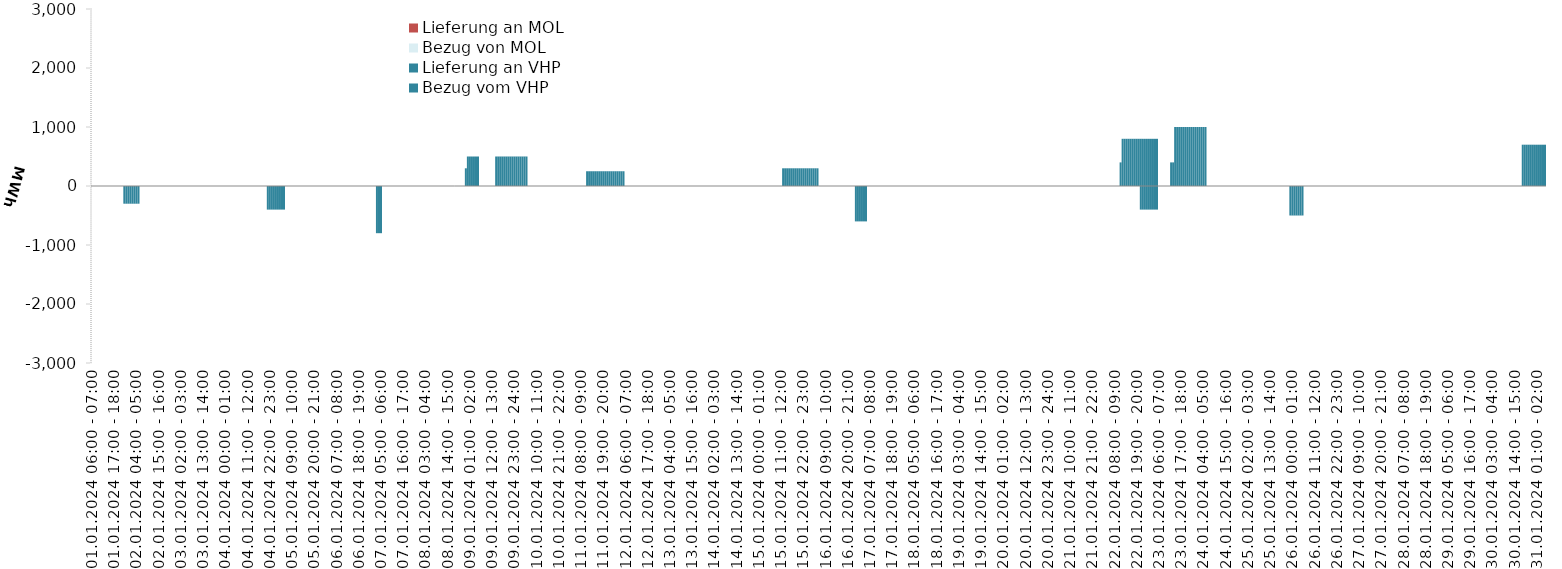
| Category | Bezug vom VHP | Lieferung an VHP | Bezug von MOL | Lieferung an MOL |
|---|---|---|---|---|
| 01.01.2024 06:00 - 07:00 | 0 | 0 | 0 | 0 |
| 01.01.2024 07:00 - 08:00 | 0 | 0 | 0 | 0 |
| 01.01.2024 08:00 - 09:00 | 0 | 0 | 0 | 0 |
| 01.01.2024 09:00 - 10:00 | 0 | 0 | 0 | 0 |
| 01.01.2024 10:00 - 11:00 | 0 | 0 | 0 | 0 |
| 01.01.2024 11:00 - 12:00 | 0 | 0 | 0 | 0 |
| 01.01.2024 12:00 - 13:00 | 0 | 0 | 0 | 0 |
| 01.01.2024 13:00 - 14:00 | 0 | 0 | 0 | 0 |
| 01.01.2024 14:00 - 15:00 | 0 | 0 | 0 | 0 |
| 01.01.2024 15:00 - 16:00 | 0 | 0 | 0 | 0 |
| 01.01.2024 16:00 - 17:00 | 0 | 0 | 0 | 0 |
| 01.01.2024 17:00 - 18:00 | 0 | 0 | 0 | 0 |
| 01.01.2024 18:00 - 19:00 | 0 | 0 | 0 | 0 |
| 01.01.2024 19:00 - 20:00 | 0 | 0 | 0 | 0 |
| 01.01.2024 20:00 - 21:00 | 0 | 0 | 0 | 0 |
| 01.01.2024 21:00 - 22:00 | 0 | 0 | 0 | 0 |
| 01.01.2024 22:00 - 23:00 | 0 | -300 | 0 | 0 |
| 01.01.2024 23:00 - 24:00 | 0 | -300 | 0 | 0 |
| 02.01.2024 00:00 - 01:00 | 0 | -300 | 0 | 0 |
| 02.01.2024 01:00 - 02:00 | 0 | -300 | 0 | 0 |
| 02.01.2024 02:00 - 03:00 | 0 | -300 | 0 | 0 |
| 02.01.2024 03:00 - 04:00 | 0 | -300 | 0 | 0 |
| 02.01.2024 04:00 - 05:00 | 0 | -300 | 0 | 0 |
| 02.01.2024 05:00 - 06:00 | 0 | -300 | 0 | 0 |
| 02.01.2024 06:00 - 07:00 | 0 | 0 | 0 | 0 |
| 02.01.2024 07:00 - 08:00 | 0 | 0 | 0 | 0 |
| 02.01.2024 08:00 - 09:00 | 0 | 0 | 0 | 0 |
| 02.01.2024 09:00 - 10:00 | 0 | 0 | 0 | 0 |
| 02.01.2024 10:00 - 11:00 | 0 | 0 | 0 | 0 |
| 02.01.2024 11:00 - 12:00 | 0 | 0 | 0 | 0 |
| 02.01.2024 12:00 - 13:00 | 0 | 0 | 0 | 0 |
| 02.01.2024 13:00 - 14:00 | 0 | 0 | 0 | 0 |
| 02.01.2024 14:00 - 15:00 | 0 | 0 | 0 | 0 |
| 02.01.2024 15:00 - 16:00 | 0 | 0 | 0 | 0 |
| 02.01.2024 16:00 - 17:00 | 0 | 0 | 0 | 0 |
| 02.01.2024 17:00 - 18:00 | 0 | 0 | 0 | 0 |
| 02.01.2024 18:00 - 19:00 | 0 | 0 | 0 | 0 |
| 02.01.2024 19:00 - 20:00 | 0 | 0 | 0 | 0 |
| 02.01.2024 20:00 - 21:00 | 0 | 0 | 0 | 0 |
| 02.01.2024 21:00 - 22:00 | 0 | 0 | 0 | 0 |
| 02.01.2024 22:00 - 23:00 | 0 | 0 | 0 | 0 |
| 02.01.2024 23:00 - 24:00 | 0 | 0 | 0 | 0 |
| 03.01.2024 00:00 - 01:00 | 0 | 0 | 0 | 0 |
| 03.01.2024 01:00 - 02:00 | 0 | 0 | 0 | 0 |
| 03.01.2024 02:00 - 03:00 | 0 | 0 | 0 | 0 |
| 03.01.2024 03:00 - 04:00 | 0 | 0 | 0 | 0 |
| 03.01.2024 04:00 - 05:00 | 0 | 0 | 0 | 0 |
| 03.01.2024 05:00 - 06:00 | 0 | 0 | 0 | 0 |
| 03.01.2024 06:00 - 07:00 | 0 | 0 | 0 | 0 |
| 03.01.2024 07:00 - 08:00 | 0 | 0 | 0 | 0 |
| 03.01.2024 08:00 - 09:00 | 0 | 0 | 0 | 0 |
| 03.01.2024 09:00 - 10:00 | 0 | 0 | 0 | 0 |
| 03.01.2024 10:00 - 11:00 | 0 | 0 | 0 | 0 |
| 03.01.2024 11:00 - 12:00 | 0 | 0 | 0 | 0 |
| 03.01.2024 12:00 - 13:00 | 0 | 0 | 0 | 0 |
| 03.01.2024 13:00 - 14:00 | 0 | 0 | 0 | 0 |
| 03.01.2024 14:00 - 15:00 | 0 | 0 | 0 | 0 |
| 03.01.2024 15:00 - 16:00 | 0 | 0 | 0 | 0 |
| 03.01.2024 16:00 - 17:00 | 0 | 0 | 0 | 0 |
| 03.01.2024 17:00 - 18:00 | 0 | 0 | 0 | 0 |
| 03.01.2024 18:00 - 19:00 | 0 | 0 | 0 | 0 |
| 03.01.2024 19:00 - 20:00 | 0 | 0 | 0 | 0 |
| 03.01.2024 20:00 - 21:00 | 0 | 0 | 0 | 0 |
| 03.01.2024 21:00 - 22:00 | 0 | 0 | 0 | 0 |
| 03.01.2024 22:00 - 23:00 | 0 | 0 | 0 | 0 |
| 03.01.2024 23:00 - 24:00 | 0 | 0 | 0 | 0 |
| 04.01.2024 00:00 - 01:00 | 0 | 0 | 0 | 0 |
| 04.01.2024 01:00 - 02:00 | 0 | 0 | 0 | 0 |
| 04.01.2024 02:00 - 03:00 | 0 | 0 | 0 | 0 |
| 04.01.2024 03:00 - 04:00 | 0 | 0 | 0 | 0 |
| 04.01.2024 04:00 - 05:00 | 0 | 0 | 0 | 0 |
| 04.01.2024 05:00 - 06:00 | 0 | 0 | 0 | 0 |
| 04.01.2024 06:00 - 07:00 | 0 | 0 | 0 | 0 |
| 04.01.2024 07:00 - 08:00 | 0 | 0 | 0 | 0 |
| 04.01.2024 08:00 - 09:00 | 0 | 0 | 0 | 0 |
| 04.01.2024 09:00 - 10:00 | 0 | 0 | 0 | 0 |
| 04.01.2024 10:00 - 11:00 | 0 | 0 | 0 | 0 |
| 04.01.2024 11:00 - 12:00 | 0 | 0 | 0 | 0 |
| 04.01.2024 12:00 - 13:00 | 0 | 0 | 0 | 0 |
| 04.01.2024 13:00 - 14:00 | 0 | 0 | 0 | 0 |
| 04.01.2024 14:00 - 15:00 | 0 | 0 | 0 | 0 |
| 04.01.2024 15:00 - 16:00 | 0 | 0 | 0 | 0 |
| 04.01.2024 16:00 - 17:00 | 0 | 0 | 0 | 0 |
| 04.01.2024 17:00 - 18:00 | 0 | 0 | 0 | 0 |
| 04.01.2024 18:00 - 19:00 | 0 | 0 | 0 | 0 |
| 04.01.2024 19:00 - 20:00 | 0 | 0 | 0 | 0 |
| 04.01.2024 20:00 - 21:00 | 0 | 0 | 0 | 0 |
| 04.01.2024 21:00 - 22:00 | 0 | -400 | 0 | 0 |
| 04.01.2024 22:00 - 23:00 | 0 | -400 | 0 | 0 |
| 04.01.2024 23:00 - 24:00 | 0 | -400 | 0 | 0 |
| 05.01.2024 00:00 - 01:00 | 0 | -400 | 0 | 0 |
| 05.01.2024 01:00 - 02:00 | 0 | -400 | 0 | 0 |
| 05.01.2024 02:00 - 03:00 | 0 | -400 | 0 | 0 |
| 05.01.2024 03:00 - 04:00 | 0 | -400 | 0 | 0 |
| 05.01.2024 04:00 - 05:00 | 0 | -400 | 0 | 0 |
| 05.01.2024 05:00 - 06:00 | 0 | -400 | 0 | 0 |
| 05.01.2024 06:00 - 07:00 | 0 | 0 | 0 | 0 |
| 05.01.2024 07:00 - 08:00 | 0 | 0 | 0 | 0 |
| 05.01.2024 08:00 - 09:00 | 0 | 0 | 0 | 0 |
| 05.01.2024 09:00 - 10:00 | 0 | 0 | 0 | 0 |
| 05.01.2024 10:00 - 11:00 | 0 | 0 | 0 | 0 |
| 05.01.2024 11:00 - 12:00 | 0 | 0 | 0 | 0 |
| 05.01.2024 12:00 - 13:00 | 0 | 0 | 0 | 0 |
| 05.01.2024 13:00 - 14:00 | 0 | 0 | 0 | 0 |
| 05.01.2024 14:00 - 15:00 | 0 | 0 | 0 | 0 |
| 05.01.2024 15:00 - 16:00 | 0 | 0 | 0 | 0 |
| 05.01.2024 16:00 - 17:00 | 0 | 0 | 0 | 0 |
| 05.01.2024 17:00 - 18:00 | 0 | 0 | 0 | 0 |
| 05.01.2024 18:00 - 19:00 | 0 | 0 | 0 | 0 |
| 05.01.2024 19:00 - 20:00 | 0 | 0 | 0 | 0 |
| 05.01.2024 20:00 - 21:00 | 0 | 0 | 0 | 0 |
| 05.01.2024 21:00 - 22:00 | 0 | 0 | 0 | 0 |
| 05.01.2024 22:00 - 23:00 | 0 | 0 | 0 | 0 |
| 05.01.2024 23:00 - 24:00 | 0 | 0 | 0 | 0 |
| 06.01.2024 00:00 - 01:00 | 0 | 0 | 0 | 0 |
| 06.01.2024 01:00 - 02:00 | 0 | 0 | 0 | 0 |
| 06.01.2024 02:00 - 03:00 | 0 | 0 | 0 | 0 |
| 06.01.2024 03:00 - 04:00 | 0 | 0 | 0 | 0 |
| 06.01.2024 04:00 - 05:00 | 0 | 0 | 0 | 0 |
| 06.01.2024 05:00 - 06:00 | 0 | 0 | 0 | 0 |
| 06.01.2024 06:00 - 07:00 | 0 | 0 | 0 | 0 |
| 06.01.2024 07:00 - 08:00 | 0 | 0 | 0 | 0 |
| 06.01.2024 08:00 - 09:00 | 0 | 0 | 0 | 0 |
| 06.01.2024 09:00 - 10:00 | 0 | 0 | 0 | 0 |
| 06.01.2024 10:00 - 11:00 | 0 | 0 | 0 | 0 |
| 06.01.2024 11:00 - 12:00 | 0 | 0 | 0 | 0 |
| 06.01.2024 12:00 - 13:00 | 0 | 0 | 0 | 0 |
| 06.01.2024 13:00 - 14:00 | 0 | 0 | 0 | 0 |
| 06.01.2024 14:00 - 15:00 | 0 | 0 | 0 | 0 |
| 06.01.2024 15:00 - 16:00 | 0 | 0 | 0 | 0 |
| 06.01.2024 16:00 - 17:00 | 0 | 0 | 0 | 0 |
| 06.01.2024 17:00 - 18:00 | 0 | 0 | 0 | 0 |
| 06.01.2024 18:00 - 19:00 | 0 | 0 | 0 | 0 |
| 06.01.2024 19:00 - 20:00 | 0 | 0 | 0 | 0 |
| 06.01.2024 20:00 - 21:00 | 0 | 0 | 0 | 0 |
| 06.01.2024 21:00 - 22:00 | 0 | 0 | 0 | 0 |
| 06.01.2024 22:00 - 23:00 | 0 | 0 | 0 | 0 |
| 06.01.2024 23:00 - 24:00 | 0 | 0 | 0 | 0 |
| 07.01.2024 00:00 - 01:00 | 0 | 0 | 0 | 0 |
| 07.01.2024 01:00 - 02:00 | 0 | 0 | 0 | 0 |
| 07.01.2024 02:00 - 03:00 | 0 | 0 | 0 | 0 |
| 07.01.2024 03:00 - 04:00 | 0 | -800 | 0 | 0 |
| 07.01.2024 04:00 - 05:00 | 0 | -800 | 0 | 0 |
| 07.01.2024 05:00 - 06:00 | 0 | -800 | 0 | 0 |
| 07.01.2024 06:00 - 07:00 | 0 | 0 | 0 | 0 |
| 07.01.2024 07:00 - 08:00 | 0 | 0 | 0 | 0 |
| 07.01.2024 08:00 - 09:00 | 0 | 0 | 0 | 0 |
| 07.01.2024 09:00 - 10:00 | 0 | 0 | 0 | 0 |
| 07.01.2024 10:00 - 11:00 | 0 | 0 | 0 | 0 |
| 07.01.2024 11:00 - 12:00 | 0 | 0 | 0 | 0 |
| 07.01.2024 12:00 - 13:00 | 0 | 0 | 0 | 0 |
| 07.01.2024 13:00 - 14:00 | 0 | 0 | 0 | 0 |
| 07.01.2024 14:00 - 15:00 | 0 | 0 | 0 | 0 |
| 07.01.2024 15:00 - 16:00 | 0 | 0 | 0 | 0 |
| 07.01.2024 16:00 - 17:00 | 0 | 0 | 0 | 0 |
| 07.01.2024 17:00 - 18:00 | 0 | 0 | 0 | 0 |
| 07.01.2024 18:00 - 19:00 | 0 | 0 | 0 | 0 |
| 07.01.2024 19:00 - 20:00 | 0 | 0 | 0 | 0 |
| 07.01.2024 20:00 - 21:00 | 0 | 0 | 0 | 0 |
| 07.01.2024 21:00 - 22:00 | 0 | 0 | 0 | 0 |
| 07.01.2024 22:00 - 23:00 | 0 | 0 | 0 | 0 |
| 07.01.2024 23:00 - 24:00 | 0 | 0 | 0 | 0 |
| 08.01.2024 00:00 - 01:00 | 0 | 0 | 0 | 0 |
| 08.01.2024 01:00 - 02:00 | 0 | 0 | 0 | 0 |
| 08.01.2024 02:00 - 03:00 | 0 | 0 | 0 | 0 |
| 08.01.2024 03:00 - 04:00 | 0 | 0 | 0 | 0 |
| 08.01.2024 04:00 - 05:00 | 0 | 0 | 0 | 0 |
| 08.01.2024 05:00 - 06:00 | 0 | 0 | 0 | 0 |
| 08.01.2024 06:00 - 07:00 | 0 | 0 | 0 | 0 |
| 08.01.2024 07:00 - 08:00 | 0 | 0 | 0 | 0 |
| 08.01.2024 08:00 - 09:00 | 0 | 0 | 0 | 0 |
| 08.01.2024 09:00 - 10:00 | 0 | 0 | 0 | 0 |
| 08.01.2024 10:00 - 11:00 | 0 | 0 | 0 | 0 |
| 08.01.2024 11:00 - 12:00 | 0 | 0 | 0 | 0 |
| 08.01.2024 12:00 - 13:00 | 0 | 0 | 0 | 0 |
| 08.01.2024 13:00 - 14:00 | 0 | 0 | 0 | 0 |
| 08.01.2024 14:00 - 15:00 | 0 | 0 | 0 | 0 |
| 08.01.2024 15:00 - 16:00 | 0 | 0 | 0 | 0 |
| 08.01.2024 16:00 - 17:00 | 0 | 0 | 0 | 0 |
| 08.01.2024 17:00 - 18:00 | 0 | 0 | 0 | 0 |
| 08.01.2024 18:00 - 19:00 | 0 | 0 | 0 | 0 |
| 08.01.2024 19:00 - 20:00 | 0 | 0 | 0 | 0 |
| 08.01.2024 20:00 - 21:00 | 0 | 0 | 0 | 0 |
| 08.01.2024 21:00 - 22:00 | 0 | 0 | 0 | 0 |
| 08.01.2024 22:00 - 23:00 | 0 | 0 | 0 | 0 |
| 08.01.2024 23:00 - 24:00 | 300 | 0 | 0 | 0 |
| 09.01.2024 00:00 - 01:00 | 500 | 0 | 0 | 0 |
| 09.01.2024 01:00 - 02:00 | 500 | 0 | 0 | 0 |
| 09.01.2024 02:00 - 03:00 | 500 | 0 | 0 | 0 |
| 09.01.2024 03:00 - 04:00 | 500 | 0 | 0 | 0 |
| 09.01.2024 04:00 - 05:00 | 500 | 0 | 0 | 0 |
| 09.01.2024 05:00 - 06:00 | 500 | 0 | 0 | 0 |
| 09.01.2024 06:00 - 07:00 | 0 | 0 | 0 | 0 |
| 09.01.2024 07:00 - 08:00 | 0 | 0 | 0 | 0 |
| 09.01.2024 08:00 - 09:00 | 0 | 0 | 0 | 0 |
| 09.01.2024 09:00 - 10:00 | 0 | 0 | 0 | 0 |
| 09.01.2024 10:00 - 11:00 | 0 | 0 | 0 | 0 |
| 09.01.2024 11:00 - 12:00 | 0 | 0 | 0 | 0 |
| 09.01.2024 12:00 - 13:00 | 0 | 0 | 0 | 0 |
| 09.01.2024 13:00 - 14:00 | 0 | 0 | 0 | 0 |
| 09.01.2024 14:00 - 15:00 | 500 | 0 | 0 | 0 |
| 09.01.2024 15:00 - 16:00 | 500 | 0 | 0 | 0 |
| 09.01.2024 16:00 - 17:00 | 500 | 0 | 0 | 0 |
| 09.01.2024 17:00 - 18:00 | 500 | 0 | 0 | 0 |
| 09.01.2024 18:00 - 19:00 | 500 | 0 | 0 | 0 |
| 09.01.2024 19:00 - 20:00 | 500 | 0 | 0 | 0 |
| 09.01.2024 20:00 - 21:00 | 500 | 0 | 0 | 0 |
| 09.01.2024 21:00 - 22:00 | 500 | 0 | 0 | 0 |
| 09.01.2024 22:00 - 23:00 | 500 | 0 | 0 | 0 |
| 09.01.2024 23:00 - 24:00 | 500 | 0 | 0 | 0 |
| 10.01.2024 00:00 - 01:00 | 500 | 0 | 0 | 0 |
| 10.01.2024 01:00 - 02:00 | 500 | 0 | 0 | 0 |
| 10.01.2024 02:00 - 03:00 | 500 | 0 | 0 | 0 |
| 10.01.2024 03:00 - 04:00 | 500 | 0 | 0 | 0 |
| 10.01.2024 04:00 - 05:00 | 500 | 0 | 0 | 0 |
| 10.01.2024 05:00 - 06:00 | 500 | 0 | 0 | 0 |
| 10.01.2024 06:00 - 07:00 | 0 | 0 | 0 | 0 |
| 10.01.2024 07:00 - 08:00 | 0 | 0 | 0 | 0 |
| 10.01.2024 08:00 - 09:00 | 0 | 0 | 0 | 0 |
| 10.01.2024 09:00 - 10:00 | 0 | 0 | 0 | 0 |
| 10.01.2024 10:00 - 11:00 | 0 | 0 | 0 | 0 |
| 10.01.2024 11:00 - 12:00 | 0 | 0 | 0 | 0 |
| 10.01.2024 12:00 - 13:00 | 0 | 0 | 0 | 0 |
| 10.01.2024 13:00 - 14:00 | 0 | 0 | 0 | 0 |
| 10.01.2024 14:00 - 15:00 | 0 | 0 | 0 | 0 |
| 10.01.2024 15:00 - 16:00 | 0 | 0 | 0 | 0 |
| 10.01.2024 16:00 - 17:00 | 0 | 0 | 0 | 0 |
| 10.01.2024 17:00 - 18:00 | 0 | 0 | 0 | 0 |
| 10.01.2024 18:00 - 19:00 | 0 | 0 | 0 | 0 |
| 10.01.2024 19:00 - 20:00 | 0 | 0 | 0 | 0 |
| 10.01.2024 20:00 - 21:00 | 0 | 0 | 0 | 0 |
| 10.01.2024 21:00 - 22:00 | 0 | 0 | 0 | 0 |
| 10.01.2024 22:00 - 23:00 | 0 | 0 | 0 | 0 |
| 10.01.2024 23:00 - 24:00 | 0 | 0 | 0 | 0 |
| 11.01.2024 00:00 - 01:00 | 0 | 0 | 0 | 0 |
| 11.01.2024 01:00 - 02:00 | 0 | 0 | 0 | 0 |
| 11.01.2024 02:00 - 03:00 | 0 | 0 | 0 | 0 |
| 11.01.2024 03:00 - 04:00 | 0 | 0 | 0 | 0 |
| 11.01.2024 04:00 - 05:00 | 0 | 0 | 0 | 0 |
| 11.01.2024 05:00 - 06:00 | 0 | 0 | 0 | 0 |
| 11.01.2024 06:00 - 07:00 | 0 | 0 | 0 | 0 |
| 11.01.2024 07:00 - 08:00 | 0 | 0 | 0 | 0 |
| 11.01.2024 08:00 - 09:00 | 0 | 0 | 0 | 0 |
| 11.01.2024 09:00 - 10:00 | 0 | 0 | 0 | 0 |
| 11.01.2024 10:00 - 11:00 | 0 | 0 | 0 | 0 |
| 11.01.2024 11:00 - 12:00 | 250 | 0 | 0 | 0 |
| 11.01.2024 12:00 - 13:00 | 250 | 0 | 0 | 0 |
| 11.01.2024 13:00 - 14:00 | 250 | 0 | 0 | 0 |
| 11.01.2024 14:00 - 15:00 | 250 | 0 | 0 | 0 |
| 11.01.2024 15:00 - 16:00 | 250 | 0 | 0 | 0 |
| 11.01.2024 16:00 - 17:00 | 250 | 0 | 0 | 0 |
| 11.01.2024 17:00 - 18:00 | 250 | 0 | 0 | 0 |
| 11.01.2024 18:00 - 19:00 | 250 | 0 | 0 | 0 |
| 11.01.2024 19:00 - 20:00 | 250 | 0 | 0 | 0 |
| 11.01.2024 20:00 - 21:00 | 250 | 0 | 0 | 0 |
| 11.01.2024 21:00 - 22:00 | 250 | 0 | 0 | 0 |
| 11.01.2024 22:00 - 23:00 | 250 | 0 | 0 | 0 |
| 11.01.2024 23:00 - 24:00 | 250 | 0 | 0 | 0 |
| 12.01.2024 00:00 - 01:00 | 250 | 0 | 0 | 0 |
| 12.01.2024 01:00 - 02:00 | 250 | 0 | 0 | 0 |
| 12.01.2024 02:00 - 03:00 | 250 | 0 | 0 | 0 |
| 12.01.2024 03:00 - 04:00 | 250 | 0 | 0 | 0 |
| 12.01.2024 04:00 - 05:00 | 250 | 0 | 0 | 0 |
| 12.01.2024 05:00 - 06:00 | 250 | 0 | 0 | 0 |
| 12.01.2024 06:00 - 07:00 | 0 | 0 | 0 | 0 |
| 12.01.2024 07:00 - 08:00 | 0 | 0 | 0 | 0 |
| 12.01.2024 08:00 - 09:00 | 0 | 0 | 0 | 0 |
| 12.01.2024 09:00 - 10:00 | 0 | 0 | 0 | 0 |
| 12.01.2024 10:00 - 11:00 | 0 | 0 | 0 | 0 |
| 12.01.2024 11:00 - 12:00 | 0 | 0 | 0 | 0 |
| 12.01.2024 12:00 - 13:00 | 0 | 0 | 0 | 0 |
| 12.01.2024 13:00 - 14:00 | 0 | 0 | 0 | 0 |
| 12.01.2024 14:00 - 15:00 | 0 | 0 | 0 | 0 |
| 12.01.2024 15:00 - 16:00 | 0 | 0 | 0 | 0 |
| 12.01.2024 16:00 - 17:00 | 0 | 0 | 0 | 0 |
| 12.01.2024 17:00 - 18:00 | 0 | 0 | 0 | 0 |
| 12.01.2024 18:00 - 19:00 | 0 | 0 | 0 | 0 |
| 12.01.2024 19:00 - 20:00 | 0 | 0 | 0 | 0 |
| 12.01.2024 20:00 - 21:00 | 0 | 0 | 0 | 0 |
| 12.01.2024 21:00 - 22:00 | 0 | 0 | 0 | 0 |
| 12.01.2024 22:00 - 23:00 | 0 | 0 | 0 | 0 |
| 12.01.2024 23:00 - 24:00 | 0 | 0 | 0 | 0 |
| 13.01.2024 00:00 - 01:00 | 0 | 0 | 0 | 0 |
| 13.01.2024 01:00 - 02:00 | 0 | 0 | 0 | 0 |
| 13.01.2024 02:00 - 03:00 | 0 | 0 | 0 | 0 |
| 13.01.2024 03:00 - 04:00 | 0 | 0 | 0 | 0 |
| 13.01.2024 04:00 - 05:00 | 0 | 0 | 0 | 0 |
| 13.01.2024 05:00 - 06:00 | 0 | 0 | 0 | 0 |
| 13.01.2024 06:00 - 07:00 | 0 | 0 | 0 | 0 |
| 13.01.2024 07:00 - 08:00 | 0 | 0 | 0 | 0 |
| 13.01.2024 08:00 - 09:00 | 0 | 0 | 0 | 0 |
| 13.01.2024 09:00 - 10:00 | 0 | 0 | 0 | 0 |
| 13.01.2024 10:00 - 11:00 | 0 | 0 | 0 | 0 |
| 13.01.2024 11:00 - 12:00 | 0 | 0 | 0 | 0 |
| 13.01.2024 12:00 - 13:00 | 0 | 0 | 0 | 0 |
| 13.01.2024 13:00 - 14:00 | 0 | 0 | 0 | 0 |
| 13.01.2024 14:00 - 15:00 | 0 | 0 | 0 | 0 |
| 13.01.2024 15:00 - 16:00 | 0 | 0 | 0 | 0 |
| 13.01.2024 16:00 - 17:00 | 0 | 0 | 0 | 0 |
| 13.01.2024 17:00 - 18:00 | 0 | 0 | 0 | 0 |
| 13.01.2024 18:00 - 19:00 | 0 | 0 | 0 | 0 |
| 13.01.2024 19:00 - 20:00 | 0 | 0 | 0 | 0 |
| 13.01.2024 20:00 - 21:00 | 0 | 0 | 0 | 0 |
| 13.01.2024 21:00 - 22:00 | 0 | 0 | 0 | 0 |
| 13.01.2024 22:00 - 23:00 | 0 | 0 | 0 | 0 |
| 13.01.2024 23:00 - 24:00 | 0 | 0 | 0 | 0 |
| 14.01.2024 00:00 - 01:00 | 0 | 0 | 0 | 0 |
| 14.01.2024 01:00 - 02:00 | 0 | 0 | 0 | 0 |
| 14.01.2024 02:00 - 03:00 | 0 | 0 | 0 | 0 |
| 14.01.2024 03:00 - 04:00 | 0 | 0 | 0 | 0 |
| 14.01.2024 04:00 - 05:00 | 0 | 0 | 0 | 0 |
| 14.01.2024 05:00 - 06:00 | 0 | 0 | 0 | 0 |
| 14.01.2024 06:00 - 07:00 | 0 | 0 | 0 | 0 |
| 14.01.2024 07:00 - 08:00 | 0 | 0 | 0 | 0 |
| 14.01.2024 08:00 - 09:00 | 0 | 0 | 0 | 0 |
| 14.01.2024 09:00 - 10:00 | 0 | 0 | 0 | 0 |
| 14.01.2024 10:00 - 11:00 | 0 | 0 | 0 | 0 |
| 14.01.2024 11:00 - 12:00 | 0 | 0 | 0 | 0 |
| 14.01.2024 12:00 - 13:00 | 0 | 0 | 0 | 0 |
| 14.01.2024 13:00 - 14:00 | 0 | 0 | 0 | 0 |
| 14.01.2024 14:00 - 15:00 | 0 | 0 | 0 | 0 |
| 14.01.2024 15:00 - 16:00 | 0 | 0 | 0 | 0 |
| 14.01.2024 16:00 - 17:00 | 0 | 0 | 0 | 0 |
| 14.01.2024 17:00 - 18:00 | 0 | 0 | 0 | 0 |
| 14.01.2024 18:00 - 19:00 | 0 | 0 | 0 | 0 |
| 14.01.2024 19:00 - 20:00 | 0 | 0 | 0 | 0 |
| 14.01.2024 20:00 - 21:00 | 0 | 0 | 0 | 0 |
| 14.01.2024 21:00 - 22:00 | 0 | 0 | 0 | 0 |
| 14.01.2024 22:00 - 23:00 | 0 | 0 | 0 | 0 |
| 14.01.2024 23:00 - 24:00 | 0 | 0 | 0 | 0 |
| 15.01.2024 00:00 - 01:00 | 0 | 0 | 0 | 0 |
| 15.01.2024 01:00 - 02:00 | 0 | 0 | 0 | 0 |
| 15.01.2024 02:00 - 03:00 | 0 | 0 | 0 | 0 |
| 15.01.2024 03:00 - 04:00 | 0 | 0 | 0 | 0 |
| 15.01.2024 04:00 - 05:00 | 0 | 0 | 0 | 0 |
| 15.01.2024 05:00 - 06:00 | 0 | 0 | 0 | 0 |
| 15.01.2024 06:00 - 07:00 | 0 | 0 | 0 | 0 |
| 15.01.2024 07:00 - 08:00 | 0 | 0 | 0 | 0 |
| 15.01.2024 08:00 - 09:00 | 0 | 0 | 0 | 0 |
| 15.01.2024 09:00 - 10:00 | 0 | 0 | 0 | 0 |
| 15.01.2024 10:00 - 11:00 | 0 | 0 | 0 | 0 |
| 15.01.2024 11:00 - 12:00 | 0 | 0 | 0 | 0 |
| 15.01.2024 12:00 - 13:00 | 300 | 0 | 0 | 0 |
| 15.01.2024 13:00 - 14:00 | 300 | 0 | 0 | 0 |
| 15.01.2024 14:00 - 15:00 | 300 | 0 | 0 | 0 |
| 15.01.2024 15:00 - 16:00 | 300 | 0 | 0 | 0 |
| 15.01.2024 16:00 - 17:00 | 300 | 0 | 0 | 0 |
| 15.01.2024 17:00 - 18:00 | 300 | 0 | 0 | 0 |
| 15.01.2024 18:00 - 19:00 | 300 | 0 | 0 | 0 |
| 15.01.2024 19:00 - 20:00 | 300 | 0 | 0 | 0 |
| 15.01.2024 20:00 - 21:00 | 300 | 0 | 0 | 0 |
| 15.01.2024 21:00 - 22:00 | 300 | 0 | 0 | 0 |
| 15.01.2024 22:00 - 23:00 | 300 | 0 | 0 | 0 |
| 15.01.2024 23:00 - 24:00 | 300 | 0 | 0 | 0 |
| 16.01.2024 00:00 - 01:00 | 300 | 0 | 0 | 0 |
| 16.01.2024 01:00 - 02:00 | 300 | 0 | 0 | 0 |
| 16.01.2024 02:00 - 03:00 | 300 | 0 | 0 | 0 |
| 16.01.2024 03:00 - 04:00 | 300 | 0 | 0 | 0 |
| 16.01.2024 04:00 - 05:00 | 300 | 0 | 0 | 0 |
| 16.01.2024 05:00 - 06:00 | 300 | 0 | 0 | 0 |
| 16.01.2024 06:00 - 07:00 | 0 | 0 | 0 | 0 |
| 16.01.2024 07:00 - 08:00 | 0 | 0 | 0 | 0 |
| 16.01.2024 08:00 - 09:00 | 0 | 0 | 0 | 0 |
| 16.01.2024 09:00 - 10:00 | 0 | 0 | 0 | 0 |
| 16.01.2024 10:00 - 11:00 | 0 | 0 | 0 | 0 |
| 16.01.2024 11:00 - 12:00 | 0 | 0 | 0 | 0 |
| 16.01.2024 12:00 - 13:00 | 0 | 0 | 0 | 0 |
| 16.01.2024 13:00 - 14:00 | 0 | 0 | 0 | 0 |
| 16.01.2024 14:00 - 15:00 | 0 | 0 | 0 | 0 |
| 16.01.2024 15:00 - 16:00 | 0 | 0 | 0 | 0 |
| 16.01.2024 16:00 - 17:00 | 0 | 0 | 0 | 0 |
| 16.01.2024 17:00 - 18:00 | 0 | 0 | 0 | 0 |
| 16.01.2024 18:00 - 19:00 | 0 | 0 | 0 | 0 |
| 16.01.2024 19:00 - 20:00 | 0 | 0 | 0 | 0 |
| 16.01.2024 20:00 - 21:00 | 0 | 0 | 0 | 0 |
| 16.01.2024 21:00 - 22:00 | 0 | 0 | 0 | 0 |
| 16.01.2024 22:00 - 23:00 | 0 | 0 | 0 | 0 |
| 16.01.2024 23:00 - 24:00 | 0 | 0 | 0 | 0 |
| 17.01.2024 00:00 - 01:00 | 0 | -600 | 0 | 0 |
| 17.01.2024 01:00 - 02:00 | 0 | -600 | 0 | 0 |
| 17.01.2024 02:00 - 03:00 | 0 | -600 | 0 | 0 |
| 17.01.2024 03:00 - 04:00 | 0 | -600 | 0 | 0 |
| 17.01.2024 04:00 - 05:00 | 0 | -600 | 0 | 0 |
| 17.01.2024 05:00 - 06:00 | 0 | -600 | 0 | 0 |
| 17.01.2024 06:00 - 07:00 | 0 | 0 | 0 | 0 |
| 17.01.2024 07:00 - 08:00 | 0 | 0 | 0 | 0 |
| 17.01.2024 08:00 - 09:00 | 0 | 0 | 0 | 0 |
| 17.01.2024 09:00 - 10:00 | 0 | 0 | 0 | 0 |
| 17.01.2024 10:00 - 11:00 | 0 | 0 | 0 | 0 |
| 17.01.2024 11:00 - 12:00 | 0 | 0 | 0 | 0 |
| 17.01.2024 12:00 - 13:00 | 0 | 0 | 0 | 0 |
| 17.01.2024 13:00 - 14:00 | 0 | 0 | 0 | 0 |
| 17.01.2024 14:00 - 15:00 | 0 | 0 | 0 | 0 |
| 17.01.2024 15:00 - 16:00 | 0 | 0 | 0 | 0 |
| 17.01.2024 16:00 - 17:00 | 0 | 0 | 0 | 0 |
| 17.01.2024 17:00 - 18:00 | 0 | 0 | 0 | 0 |
| 17.01.2024 18:00 - 19:00 | 0 | 0 | 0 | 0 |
| 17.01.2024 19:00 - 20:00 | 0 | 0 | 0 | 0 |
| 17.01.2024 20:00 - 21:00 | 0 | 0 | 0 | 0 |
| 17.01.2024 21:00 - 22:00 | 0 | 0 | 0 | 0 |
| 17.01.2024 22:00 - 23:00 | 0 | 0 | 0 | 0 |
| 17.01.2024 23:00 - 24:00 | 0 | 0 | 0 | 0 |
| 18.01.2024 00:00 - 01:00 | 0 | 0 | 0 | 0 |
| 18.01.2024 01:00 - 02:00 | 0 | 0 | 0 | 0 |
| 18.01.2024 02:00 - 03:00 | 0 | 0 | 0 | 0 |
| 18.01.2024 03:00 - 04:00 | 0 | 0 | 0 | 0 |
| 18.01.2024 04:00 - 05:00 | 0 | 0 | 0 | 0 |
| 18.01.2024 05:00 - 06:00 | 0 | 0 | 0 | 0 |
| 18.01.2024 06:00 - 07:00 | 0 | 0 | 0 | 0 |
| 18.01.2024 07:00 - 08:00 | 0 | 0 | 0 | 0 |
| 18.01.2024 08:00 - 09:00 | 0 | 0 | 0 | 0 |
| 18.01.2024 09:00 - 10:00 | 0 | 0 | 0 | 0 |
| 18.01.2024 10:00 - 11:00 | 0 | 0 | 0 | 0 |
| 18.01.2024 11:00 - 12:00 | 0 | 0 | 0 | 0 |
| 18.01.2024 12:00 - 13:00 | 0 | 0 | 0 | 0 |
| 18.01.2024 13:00 - 14:00 | 0 | 0 | 0 | 0 |
| 18.01.2024 14:00 - 15:00 | 0 | 0 | 0 | 0 |
| 18.01.2024 15:00 - 16:00 | 0 | 0 | 0 | 0 |
| 18.01.2024 16:00 - 17:00 | 0 | 0 | 0 | 0 |
| 18.01.2024 17:00 - 18:00 | 0 | 0 | 0 | 0 |
| 18.01.2024 18:00 - 19:00 | 0 | 0 | 0 | 0 |
| 18.01.2024 19:00 - 20:00 | 0 | 0 | 0 | 0 |
| 18.01.2024 20:00 - 21:00 | 0 | 0 | 0 | 0 |
| 18.01.2024 21:00 - 22:00 | 0 | 0 | 0 | 0 |
| 18.01.2024 22:00 - 23:00 | 0 | 0 | 0 | 0 |
| 18.01.2024 23:00 - 24:00 | 0 | 0 | 0 | 0 |
| 19.01.2024 00:00 - 01:00 | 0 | 0 | 0 | 0 |
| 19.01.2024 01:00 - 02:00 | 0 | 0 | 0 | 0 |
| 19.01.2024 02:00 - 03:00 | 0 | 0 | 0 | 0 |
| 19.01.2024 03:00 - 04:00 | 0 | 0 | 0 | 0 |
| 19.01.2024 04:00 - 05:00 | 0 | 0 | 0 | 0 |
| 19.01.2024 05:00 - 06:00 | 0 | 0 | 0 | 0 |
| 19.01.2024 06:00 - 07:00 | 0 | 0 | 0 | 0 |
| 19.01.2024 07:00 - 08:00 | 0 | 0 | 0 | 0 |
| 19.01.2024 08:00 - 09:00 | 0 | 0 | 0 | 0 |
| 19.01.2024 09:00 - 10:00 | 0 | 0 | 0 | 0 |
| 19.01.2024 10:00 - 11:00 | 0 | 0 | 0 | 0 |
| 19.01.2024 11:00 - 12:00 | 0 | 0 | 0 | 0 |
| 19.01.2024 12:00 - 13:00 | 0 | 0 | 0 | 0 |
| 19.01.2024 13:00 - 14:00 | 0 | 0 | 0 | 0 |
| 19.01.2024 14:00 - 15:00 | 0 | 0 | 0 | 0 |
| 19.01.2024 15:00 - 16:00 | 0 | 0 | 0 | 0 |
| 19.01.2024 16:00 - 17:00 | 0 | 0 | 0 | 0 |
| 19.01.2024 17:00 - 18:00 | 0 | 0 | 0 | 0 |
| 19.01.2024 18:00 - 19:00 | 0 | 0 | 0 | 0 |
| 19.01.2024 19:00 - 20:00 | 0 | 0 | 0 | 0 |
| 19.01.2024 20:00 - 21:00 | 0 | 0 | 0 | 0 |
| 19.01.2024 21:00 - 22:00 | 0 | 0 | 0 | 0 |
| 19.01.2024 22:00 - 23:00 | 0 | 0 | 0 | 0 |
| 19.01.2024 23:00 - 24:00 | 0 | 0 | 0 | 0 |
| 20.01.2024 00:00 - 01:00 | 0 | 0 | 0 | 0 |
| 20.01.2024 01:00 - 02:00 | 0 | 0 | 0 | 0 |
| 20.01.2024 02:00 - 03:00 | 0 | 0 | 0 | 0 |
| 20.01.2024 03:00 - 04:00 | 0 | 0 | 0 | 0 |
| 20.01.2024 04:00 - 05:00 | 0 | 0 | 0 | 0 |
| 20.01.2024 05:00 - 06:00 | 0 | 0 | 0 | 0 |
| 20.01.2024 06:00 - 07:00 | 0 | 0 | 0 | 0 |
| 20.01.2024 07:00 - 08:00 | 0 | 0 | 0 | 0 |
| 20.01.2024 08:00 - 09:00 | 0 | 0 | 0 | 0 |
| 20.01.2024 09:00 - 10:00 | 0 | 0 | 0 | 0 |
| 20.01.2024 10:00 - 11:00 | 0 | 0 | 0 | 0 |
| 20.01.2024 11:00 - 12:00 | 0 | 0 | 0 | 0 |
| 20.01.2024 12:00 - 13:00 | 0 | 0 | 0 | 0 |
| 20.01.2024 13:00 - 14:00 | 0 | 0 | 0 | 0 |
| 20.01.2024 14:00 - 15:00 | 0 | 0 | 0 | 0 |
| 20.01.2024 15:00 - 16:00 | 0 | 0 | 0 | 0 |
| 20.01.2024 16:00 - 17:00 | 0 | 0 | 0 | 0 |
| 20.01.2024 17:00 - 18:00 | 0 | 0 | 0 | 0 |
| 20.01.2024 18:00 - 19:00 | 0 | 0 | 0 | 0 |
| 20.01.2024 19:00 - 20:00 | 0 | 0 | 0 | 0 |
| 20.01.2024 20:00 - 21:00 | 0 | 0 | 0 | 0 |
| 20.01.2024 21:00 - 22:00 | 0 | 0 | 0 | 0 |
| 20.01.2024 22:00 - 23:00 | 0 | 0 | 0 | 0 |
| 20.01.2024 23:00 - 24:00 | 0 | 0 | 0 | 0 |
| 21.01.2024 00:00 - 01:00 | 0 | 0 | 0 | 0 |
| 21.01.2024 01:00 - 02:00 | 0 | 0 | 0 | 0 |
| 21.01.2024 02:00 - 03:00 | 0 | 0 | 0 | 0 |
| 21.01.2024 03:00 - 04:00 | 0 | 0 | 0 | 0 |
| 21.01.2024 04:00 - 05:00 | 0 | 0 | 0 | 0 |
| 21.01.2024 05:00 - 06:00 | 0 | 0 | 0 | 0 |
| 21.01.2024 06:00 - 07:00 | 0 | 0 | 0 | 0 |
| 21.01.2024 07:00 - 08:00 | 0 | 0 | 0 | 0 |
| 21.01.2024 08:00 - 09:00 | 0 | 0 | 0 | 0 |
| 21.01.2024 09:00 - 10:00 | 0 | 0 | 0 | 0 |
| 21.01.2024 10:00 - 11:00 | 0 | 0 | 0 | 0 |
| 21.01.2024 11:00 - 12:00 | 0 | 0 | 0 | 0 |
| 21.01.2024 12:00 - 13:00 | 0 | 0 | 0 | 0 |
| 21.01.2024 13:00 - 14:00 | 0 | 0 | 0 | 0 |
| 21.01.2024 14:00 - 15:00 | 0 | 0 | 0 | 0 |
| 21.01.2024 15:00 - 16:00 | 0 | 0 | 0 | 0 |
| 21.01.2024 16:00 - 17:00 | 0 | 0 | 0 | 0 |
| 21.01.2024 17:00 - 18:00 | 0 | 0 | 0 | 0 |
| 21.01.2024 18:00 - 19:00 | 0 | 0 | 0 | 0 |
| 21.01.2024 19:00 - 20:00 | 0 | 0 | 0 | 0 |
| 21.01.2024 20:00 - 21:00 | 0 | 0 | 0 | 0 |
| 21.01.2024 21:00 - 22:00 | 0 | 0 | 0 | 0 |
| 21.01.2024 22:00 - 23:00 | 0 | 0 | 0 | 0 |
| 21.01.2024 23:00 - 24:00 | 0 | 0 | 0 | 0 |
| 22.01.2024 00:00 - 01:00 | 0 | 0 | 0 | 0 |
| 22.01.2024 01:00 - 02:00 | 0 | 0 | 0 | 0 |
| 22.01.2024 02:00 - 03:00 | 0 | 0 | 0 | 0 |
| 22.01.2024 03:00 - 04:00 | 0 | 0 | 0 | 0 |
| 22.01.2024 04:00 - 05:00 | 0 | 0 | 0 | 0 |
| 22.01.2024 05:00 - 06:00 | 0 | 0 | 0 | 0 |
| 22.01.2024 06:00 - 07:00 | 0 | 0 | 0 | 0 |
| 22.01.2024 07:00 - 08:00 | 0 | 0 | 0 | 0 |
| 22.01.2024 08:00 - 09:00 | 0 | 0 | 0 | 0 |
| 22.01.2024 09:00 - 10:00 | 0 | 0 | 0 | 0 |
| 22.01.2024 10:00 - 11:00 | 0 | 0 | 0 | 0 |
| 22.01.2024 11:00 - 12:00 | 400 | 0 | 0 | 0 |
| 22.01.2024 12:00 - 13:00 | 800 | 0 | 0 | 0 |
| 22.01.2024 13:00 - 14:00 | 800 | 0 | 0 | 0 |
| 22.01.2024 14:00 - 15:00 | 800 | 0 | 0 | 0 |
| 22.01.2024 15:00 - 16:00 | 800 | 0 | 0 | 0 |
| 22.01.2024 16:00 - 17:00 | 800 | 0 | 0 | 0 |
| 22.01.2024 17:00 - 18:00 | 800 | 0 | 0 | 0 |
| 22.01.2024 18:00 - 19:00 | 800 | 0 | 0 | 0 |
| 22.01.2024 19:00 - 20:00 | 800 | 0 | 0 | 0 |
| 22.01.2024 20:00 - 21:00 | 800 | 0 | 0 | 0 |
| 22.01.2024 21:00 - 22:00 | 800 | -400 | 0 | 0 |
| 22.01.2024 22:00 - 23:00 | 800 | -400 | 0 | 0 |
| 22.01.2024 23:00 - 24:00 | 800 | -400 | 0 | 0 |
| 23.01.2024 00:00 - 01:00 | 800 | -400 | 0 | 0 |
| 23.01.2024 01:00 - 02:00 | 800 | -400 | 0 | 0 |
| 23.01.2024 02:00 - 03:00 | 800 | -400 | 0 | 0 |
| 23.01.2024 03:00 - 04:00 | 800 | -400 | 0 | 0 |
| 23.01.2024 04:00 - 05:00 | 800 | -400 | 0 | 0 |
| 23.01.2024 05:00 - 06:00 | 800 | -400 | 0 | 0 |
| 23.01.2024 06:00 - 07:00 | 0 | 0 | 0 | 0 |
| 23.01.2024 07:00 - 08:00 | 0 | 0 | 0 | 0 |
| 23.01.2024 08:00 - 09:00 | 0 | 0 | 0 | 0 |
| 23.01.2024 09:00 - 10:00 | 0 | 0 | 0 | 0 |
| 23.01.2024 10:00 - 11:00 | 0 | 0 | 0 | 0 |
| 23.01.2024 11:00 - 12:00 | 0 | 0 | 0 | 0 |
| 23.01.2024 12:00 - 13:00 | 400 | 0 | 0 | 0 |
| 23.01.2024 13:00 - 14:00 | 400 | 0 | 0 | 0 |
| 23.01.2024 14:00 - 15:00 | 1000 | 0 | 0 | 0 |
| 23.01.2024 15:00 - 16:00 | 1000 | 0 | 0 | 0 |
| 23.01.2024 16:00 - 17:00 | 1000 | 0 | 0 | 0 |
| 23.01.2024 17:00 - 18:00 | 1000 | 0 | 0 | 0 |
| 23.01.2024 18:00 - 19:00 | 1000 | 0 | 0 | 0 |
| 23.01.2024 19:00 - 20:00 | 1000 | 0 | 0 | 0 |
| 23.01.2024 20:00 - 21:00 | 1000 | 0 | 0 | 0 |
| 23.01.2024 21:00 - 22:00 | 1000 | 0 | 0 | 0 |
| 23.01.2024 22:00 - 23:00 | 1000 | 0 | 0 | 0 |
| 23.01.2024 23:00 - 24:00 | 1000 | 0 | 0 | 0 |
| 24.01.2024 00:00 - 01:00 | 1000 | 0 | 0 | 0 |
| 24.01.2024 01:00 - 02:00 | 1000 | 0 | 0 | 0 |
| 24.01.2024 02:00 - 03:00 | 1000 | 0 | 0 | 0 |
| 24.01.2024 03:00 - 04:00 | 1000 | 0 | 0 | 0 |
| 24.01.2024 04:00 - 05:00 | 1000 | 0 | 0 | 0 |
| 24.01.2024 05:00 - 06:00 | 1000 | 0 | 0 | 0 |
| 24.01.2024 06:00 - 07:00 | 0 | 0 | 0 | 0 |
| 24.01.2024 07:00 - 08:00 | 0 | 0 | 0 | 0 |
| 24.01.2024 08:00 - 09:00 | 0 | 0 | 0 | 0 |
| 24.01.2024 09:00 - 10:00 | 0 | 0 | 0 | 0 |
| 24.01.2024 10:00 - 11:00 | 0 | 0 | 0 | 0 |
| 24.01.2024 11:00 - 12:00 | 0 | 0 | 0 | 0 |
| 24.01.2024 12:00 - 13:00 | 0 | 0 | 0 | 0 |
| 24.01.2024 13:00 - 14:00 | 0 | 0 | 0 | 0 |
| 24.01.2024 14:00 - 15:00 | 0 | 0 | 0 | 0 |
| 24.01.2024 15:00 - 16:00 | 0 | 0 | 0 | 0 |
| 24.01.2024 16:00 - 17:00 | 0 | 0 | 0 | 0 |
| 24.01.2024 17:00 - 18:00 | 0 | 0 | 0 | 0 |
| 24.01.2024 18:00 - 19:00 | 0 | 0 | 0 | 0 |
| 24.01.2024 19:00 - 20:00 | 0 | 0 | 0 | 0 |
| 24.01.2024 20:00 - 21:00 | 0 | 0 | 0 | 0 |
| 24.01.2024 21:00 - 22:00 | 0 | 0 | 0 | 0 |
| 24.01.2024 22:00 - 23:00 | 0 | 0 | 0 | 0 |
| 24.01.2024 23:00 - 24:00 | 0 | 0 | 0 | 0 |
| 25.01.2024 00:00 - 01:00 | 0 | 0 | 0 | 0 |
| 25.01.2024 01:00 - 02:00 | 0 | 0 | 0 | 0 |
| 25.01.2024 02:00 - 03:00 | 0 | 0 | 0 | 0 |
| 25.01.2024 03:00 - 04:00 | 0 | 0 | 0 | 0 |
| 25.01.2024 04:00 - 05:00 | 0 | 0 | 0 | 0 |
| 25.01.2024 05:00 - 06:00 | 0 | 0 | 0 | 0 |
| 25.01.2024 06:00 - 07:00 | 0 | 0 | 0 | 0 |
| 25.01.2024 07:00 - 08:00 | 0 | 0 | 0 | 0 |
| 25.01.2024 08:00 - 09:00 | 0 | 0 | 0 | 0 |
| 25.01.2024 09:00 - 10:00 | 0 | 0 | 0 | 0 |
| 25.01.2024 10:00 - 11:00 | 0 | 0 | 0 | 0 |
| 25.01.2024 11:00 - 12:00 | 0 | 0 | 0 | 0 |
| 25.01.2024 12:00 - 13:00 | 0 | 0 | 0 | 0 |
| 25.01.2024 13:00 - 14:00 | 0 | 0 | 0 | 0 |
| 25.01.2024 14:00 - 15:00 | 0 | 0 | 0 | 0 |
| 25.01.2024 15:00 - 16:00 | 0 | 0 | 0 | 0 |
| 25.01.2024 16:00 - 17:00 | 0 | 0 | 0 | 0 |
| 25.01.2024 17:00 - 18:00 | 0 | 0 | 0 | 0 |
| 25.01.2024 18:00 - 19:00 | 0 | 0 | 0 | 0 |
| 25.01.2024 19:00 - 20:00 | 0 | 0 | 0 | 0 |
| 25.01.2024 20:00 - 21:00 | 0 | 0 | 0 | 0 |
| 25.01.2024 21:00 - 22:00 | 0 | 0 | 0 | 0 |
| 25.01.2024 22:00 - 23:00 | 0 | 0 | 0 | 0 |
| 25.01.2024 23:00 - 24:00 | 0 | -500 | 0 | 0 |
| 26.01.2024 00:00 - 01:00 | 0 | -500 | 0 | 0 |
| 26.01.2024 01:00 - 02:00 | 0 | -500 | 0 | 0 |
| 26.01.2024 02:00 - 03:00 | 0 | -500 | 0 | 0 |
| 26.01.2024 03:00 - 04:00 | 0 | -500 | 0 | 0 |
| 26.01.2024 04:00 - 05:00 | 0 | -500 | 0 | 0 |
| 26.01.2024 05:00 - 06:00 | 0 | -500 | 0 | 0 |
| 26.01.2024 06:00 - 07:00 | 0 | 0 | 0 | 0 |
| 26.01.2024 07:00 - 08:00 | 0 | 0 | 0 | 0 |
| 26.01.2024 08:00 - 09:00 | 0 | 0 | 0 | 0 |
| 26.01.2024 09:00 - 10:00 | 0 | 0 | 0 | 0 |
| 26.01.2024 10:00 - 11:00 | 0 | 0 | 0 | 0 |
| 26.01.2024 11:00 - 12:00 | 0 | 0 | 0 | 0 |
| 26.01.2024 12:00 - 13:00 | 0 | 0 | 0 | 0 |
| 26.01.2024 13:00 - 14:00 | 0 | 0 | 0 | 0 |
| 26.01.2024 14:00 - 15:00 | 0 | 0 | 0 | 0 |
| 26.01.2024 15:00 - 16:00 | 0 | 0 | 0 | 0 |
| 26.01.2024 16:00 - 17:00 | 0 | 0 | 0 | 0 |
| 26.01.2024 17:00 - 18:00 | 0 | 0 | 0 | 0 |
| 26.01.2024 18:00 - 19:00 | 0 | 0 | 0 | 0 |
| 26.01.2024 19:00 - 20:00 | 0 | 0 | 0 | 0 |
| 26.01.2024 20:00 - 21:00 | 0 | 0 | 0 | 0 |
| 26.01.2024 21:00 - 22:00 | 0 | 0 | 0 | 0 |
| 26.01.2024 22:00 - 23:00 | 0 | 0 | 0 | 0 |
| 26.01.2024 23:00 - 24:00 | 0 | 0 | 0 | 0 |
| 27.01.2024 00:00 - 01:00 | 0 | 0 | 0 | 0 |
| 27.01.2024 01:00 - 02:00 | 0 | 0 | 0 | 0 |
| 27.01.2024 02:00 - 03:00 | 0 | 0 | 0 | 0 |
| 27.01.2024 03:00 - 04:00 | 0 | 0 | 0 | 0 |
| 27.01.2024 04:00 - 05:00 | 0 | 0 | 0 | 0 |
| 27.01.2024 05:00 - 06:00 | 0 | 0 | 0 | 0 |
| 27.01.2024 06:00 - 07:00 | 0 | 0 | 0 | 0 |
| 27.01.2024 07:00 - 08:00 | 0 | 0 | 0 | 0 |
| 27.01.2024 08:00 - 09:00 | 0 | 0 | 0 | 0 |
| 27.01.2024 09:00 - 10:00 | 0 | 0 | 0 | 0 |
| 27.01.2024 10:00 - 11:00 | 0 | 0 | 0 | 0 |
| 27.01.2024 11:00 - 12:00 | 0 | 0 | 0 | 0 |
| 27.01.2024 12:00 - 13:00 | 0 | 0 | 0 | 0 |
| 27.01.2024 13:00 - 14:00 | 0 | 0 | 0 | 0 |
| 27.01.2024 14:00 - 15:00 | 0 | 0 | 0 | 0 |
| 27.01.2024 15:00 - 16:00 | 0 | 0 | 0 | 0 |
| 27.01.2024 16:00 - 17:00 | 0 | 0 | 0 | 0 |
| 27.01.2024 17:00 - 18:00 | 0 | 0 | 0 | 0 |
| 27.01.2024 18:00 - 19:00 | 0 | 0 | 0 | 0 |
| 27.01.2024 19:00 - 20:00 | 0 | 0 | 0 | 0 |
| 27.01.2024 20:00 - 21:00 | 0 | 0 | 0 | 0 |
| 27.01.2024 21:00 - 22:00 | 0 | 0 | 0 | 0 |
| 27.01.2024 22:00 - 23:00 | 0 | 0 | 0 | 0 |
| 27.01.2024 23:00 - 24:00 | 0 | 0 | 0 | 0 |
| 28.01.2024 00:00 - 01:00 | 0 | 0 | 0 | 0 |
| 28.01.2024 01:00 - 02:00 | 0 | 0 | 0 | 0 |
| 28.01.2024 02:00 - 03:00 | 0 | 0 | 0 | 0 |
| 28.01.2024 03:00 - 04:00 | 0 | 0 | 0 | 0 |
| 28.01.2024 04:00 - 05:00 | 0 | 0 | 0 | 0 |
| 28.01.2024 05:00 - 06:00 | 0 | 0 | 0 | 0 |
| 28.01.2024 06:00 - 07:00 | 0 | 0 | 0 | 0 |
| 28.01.2024 07:00 - 08:00 | 0 | 0 | 0 | 0 |
| 28.01.2024 08:00 - 09:00 | 0 | 0 | 0 | 0 |
| 28.01.2024 09:00 - 10:00 | 0 | 0 | 0 | 0 |
| 28.01.2024 10:00 - 11:00 | 0 | 0 | 0 | 0 |
| 28.01.2024 11:00 - 12:00 | 0 | 0 | 0 | 0 |
| 28.01.2024 12:00 - 13:00 | 0 | 0 | 0 | 0 |
| 28.01.2024 13:00 - 14:00 | 0 | 0 | 0 | 0 |
| 28.01.2024 14:00 - 15:00 | 0 | 0 | 0 | 0 |
| 28.01.2024 15:00 - 16:00 | 0 | 0 | 0 | 0 |
| 28.01.2024 16:00 - 17:00 | 0 | 0 | 0 | 0 |
| 28.01.2024 17:00 - 18:00 | 0 | 0 | 0 | 0 |
| 28.01.2024 18:00 - 19:00 | 0 | 0 | 0 | 0 |
| 28.01.2024 19:00 - 20:00 | 0 | 0 | 0 | 0 |
| 28.01.2024 20:00 - 21:00 | 0 | 0 | 0 | 0 |
| 28.01.2024 21:00 - 22:00 | 0 | 0 | 0 | 0 |
| 28.01.2024 22:00 - 23:00 | 0 | 0 | 0 | 0 |
| 28.01.2024 23:00 - 24:00 | 0 | 0 | 0 | 0 |
| 29.01.2024 00:00 - 01:00 | 0 | 0 | 0 | 0 |
| 29.01.2024 01:00 - 02:00 | 0 | 0 | 0 | 0 |
| 29.01.2024 02:00 - 03:00 | 0 | 0 | 0 | 0 |
| 29.01.2024 03:00 - 04:00 | 0 | 0 | 0 | 0 |
| 29.01.2024 04:00 - 05:00 | 0 | 0 | 0 | 0 |
| 29.01.2024 05:00 - 06:00 | 0 | 0 | 0 | 0 |
| 29.01.2024 06:00 - 07:00 | 0 | 0 | 0 | 0 |
| 29.01.2024 07:00 - 08:00 | 0 | 0 | 0 | 0 |
| 29.01.2024 08:00 - 09:00 | 0 | 0 | 0 | 0 |
| 29.01.2024 09:00 - 10:00 | 0 | 0 | 0 | 0 |
| 29.01.2024 10:00 - 11:00 | 0 | 0 | 0 | 0 |
| 29.01.2024 11:00 - 12:00 | 0 | 0 | 0 | 0 |
| 29.01.2024 12:00 - 13:00 | 0 | 0 | 0 | 0 |
| 29.01.2024 13:00 - 14:00 | 0 | 0 | 0 | 0 |
| 29.01.2024 14:00 - 15:00 | 0 | 0 | 0 | 0 |
| 29.01.2024 15:00 - 16:00 | 0 | 0 | 0 | 0 |
| 29.01.2024 16:00 - 17:00 | 0 | 0 | 0 | 0 |
| 29.01.2024 17:00 - 18:00 | 0 | 0 | 0 | 0 |
| 29.01.2024 18:00 - 19:00 | 0 | 0 | 0 | 0 |
| 29.01.2024 19:00 - 20:00 | 0 | 0 | 0 | 0 |
| 29.01.2024 20:00 - 21:00 | 0 | 0 | 0 | 0 |
| 29.01.2024 21:00 - 22:00 | 0 | 0 | 0 | 0 |
| 29.01.2024 22:00 - 23:00 | 0 | 0 | 0 | 0 |
| 29.01.2024 23:00 - 24:00 | 0 | 0 | 0 | 0 |
| 30.01.2024 00:00 - 01:00 | 0 | 0 | 0 | 0 |
| 30.01.2024 01:00 - 02:00 | 0 | 0 | 0 | 0 |
| 30.01.2024 02:00 - 03:00 | 0 | 0 | 0 | 0 |
| 30.01.2024 03:00 - 04:00 | 0 | 0 | 0 | 0 |
| 30.01.2024 04:00 - 05:00 | 0 | 0 | 0 | 0 |
| 30.01.2024 05:00 - 06:00 | 0 | 0 | 0 | 0 |
| 30.01.2024 06:00 - 07:00 | 0 | 0 | 0 | 0 |
| 30.01.2024 07:00 - 08:00 | 0 | 0 | 0 | 0 |
| 30.01.2024 08:00 - 09:00 | 0 | 0 | 0 | 0 |
| 30.01.2024 09:00 - 10:00 | 0 | 0 | 0 | 0 |
| 30.01.2024 10:00 - 11:00 | 0 | 0 | 0 | 0 |
| 30.01.2024 11:00 - 12:00 | 0 | 0 | 0 | 0 |
| 30.01.2024 12:00 - 13:00 | 0 | 0 | 0 | 0 |
| 30.01.2024 13:00 - 14:00 | 0 | 0 | 0 | 0 |
| 30.01.2024 14:00 - 15:00 | 0 | 0 | 0 | 0 |
| 30.01.2024 15:00 - 16:00 | 0 | 0 | 0 | 0 |
| 30.01.2024 16:00 - 17:00 | 0 | 0 | 0 | 0 |
| 30.01.2024 17:00 - 18:00 | 0 | 0 | 0 | 0 |
| 30.01.2024 18:00 - 19:00 | 700 | 0 | 0 | 0 |
| 30.01.2024 19:00 - 20:00 | 700 | 0 | 0 | 0 |
| 30.01.2024 20:00 - 21:00 | 700 | 0 | 0 | 0 |
| 30.01.2024 21:00 - 22:00 | 700 | 0 | 0 | 0 |
| 30.01.2024 22:00 - 23:00 | 700 | 0 | 0 | 0 |
| 30.01.2024 23:00 - 24:00 | 700 | 0 | 0 | 0 |
| 31.01.2024 00:00 - 01:00 | 700 | 0 | 0 | 0 |
| 31.01.2024 01:00 - 02:00 | 700 | 0 | 0 | 0 |
| 31.01.2024 02:00 - 03:00 | 700 | 0 | 0 | 0 |
| 31.01.2024 03:00 - 04:00 | 700 | 0 | 0 | 0 |
| 31.01.2024 04:00 - 05:00 | 700 | 0 | 0 | 0 |
| 31.01.2024 05:00 - 06:00 | 700 | 0 | 0 | 0 |